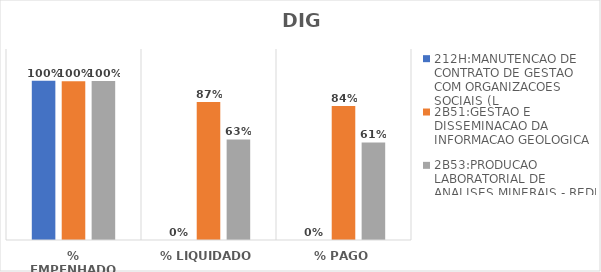
| Category | 212H:MANUTENCAO DE CONTRATO DE GESTAO COM ORGANIZACOES SOCIAIS (L | 2B51:GESTAO E DISSEMINACAO DA INFORMACAO GEOLOGICA | 2B53:PRODUCAO LABORATORIAL DE ANALISES MINERAIS - REDE LAMIN |
|---|---|---|---|
| % EMPENHADO | 1 | 0.998 | 0.998 |
| % LIQUIDADO | 0 | 0.866 | 0.632 |
| % PAGO | 0 | 0.842 | 0.613 |